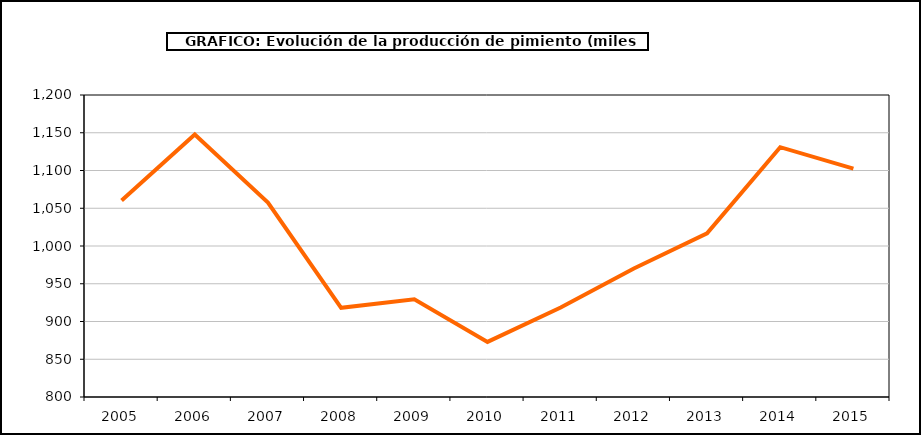
| Category | producción |
|---|---|
| 2005.0 | 1060.362 |
| 2006.0 | 1147.774 |
| 2007.0 | 1057.533 |
| 2008.0 | 918.14 |
| 2009.0 | 929.317 |
| 2010.0 | 873.011 |
| 2011.0 | 918.549 |
| 2012.0 | 970.296 |
| 2013.0 | 1016.811 |
| 2014.0 | 1130.863 |
| 2015.0 | 1102.522 |